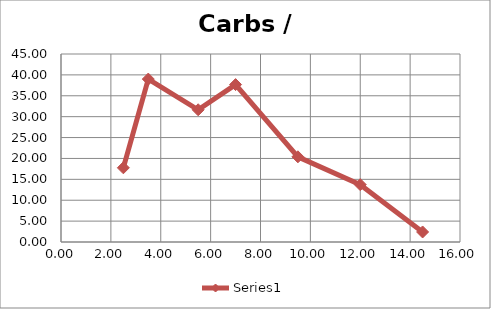
| Category | Series 0 |
|---|---|
| 2.5 | 17.76 |
| 3.5 | 39 |
| 5.5 | 31.65 |
| 7.0 | 37.68 |
| 9.5 | 20.388 |
| 12.0 | 13.728 |
| 14.5 | 2.4 |